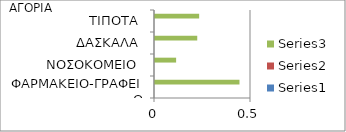
| Category | Series 0 | Series 1 | Series 2 |
|---|---|---|---|
| ΦΑΡΜΑΚΕΙΟ-ΓΡΑΦΕΙΟ |  |  | 0.44 |
| ΝΟΣΟΚΟΜΕΙΟ |  |  | 0.11 |
| ΔΑΣΚΑΛΑ |  |  | 0.22 |
| ΤΙΠΟΤΑ |  |  | 0.23 |